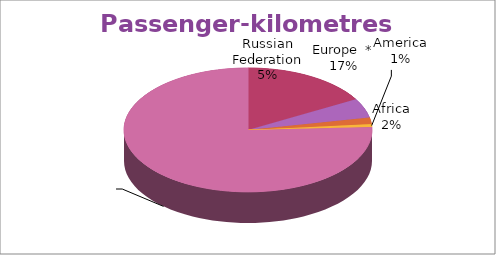
| Category | Series 0 |
|---|---|
| Europe  * | 480.022 |
| Russian Federation | 144.612 |
| Africa | 49.332 |
| America | 20.882 |
| Asia Oceania and Middle East | 2172.215 |